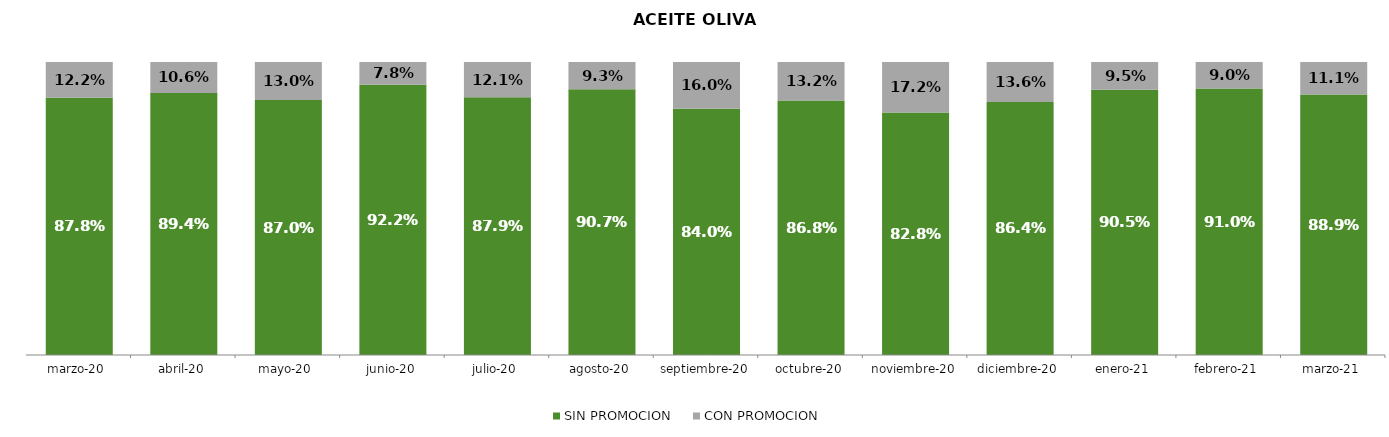
| Category | SIN PROMOCION   | CON PROMOCION   |
|---|---|---|
| 2020-03-01 | 0.878 | 0.122 |
| 2020-04-01 | 0.894 | 0.106 |
| 2020-05-01 | 0.87 | 0.13 |
| 2020-06-01 | 0.922 | 0.078 |
| 2020-07-01 | 0.879 | 0.121 |
| 2020-08-01 | 0.907 | 0.093 |
| 2020-09-01 | 0.84 | 0.16 |
| 2020-10-01 | 0.868 | 0.132 |
| 2020-11-01 | 0.828 | 0.172 |
| 2020-12-01 | 0.864 | 0.136 |
| 2021-01-01 | 0.905 | 0.095 |
| 2021-02-01 | 0.91 | 0.09 |
| 2021-03-01 | 0.889 | 0.111 |